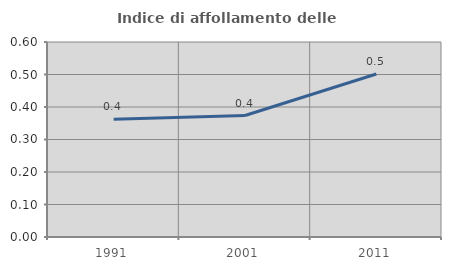
| Category | Indice di affollamento delle abitazioni  |
|---|---|
| 1991.0 | 0.362 |
| 2001.0 | 0.374 |
| 2011.0 | 0.502 |